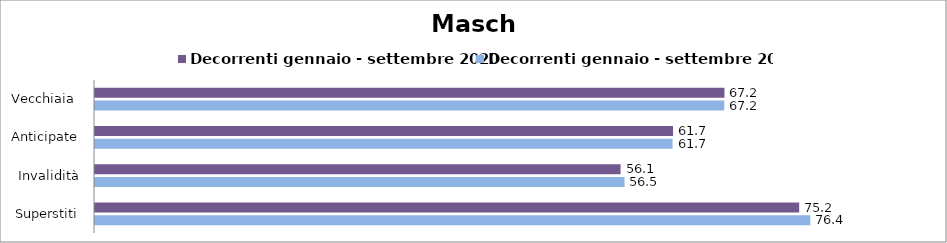
| Category | Decorrenti gennaio - settembre 2020 | Decorrenti gennaio - settembre 2021 |
|---|---|---|
| Vecchiaia  | 67.2 | 67.18 |
| Anticipate | 61.71 | 61.66 |
| Invalidità | 56.11 | 56.53 |
| Superstiti | 75.18 | 76.37 |